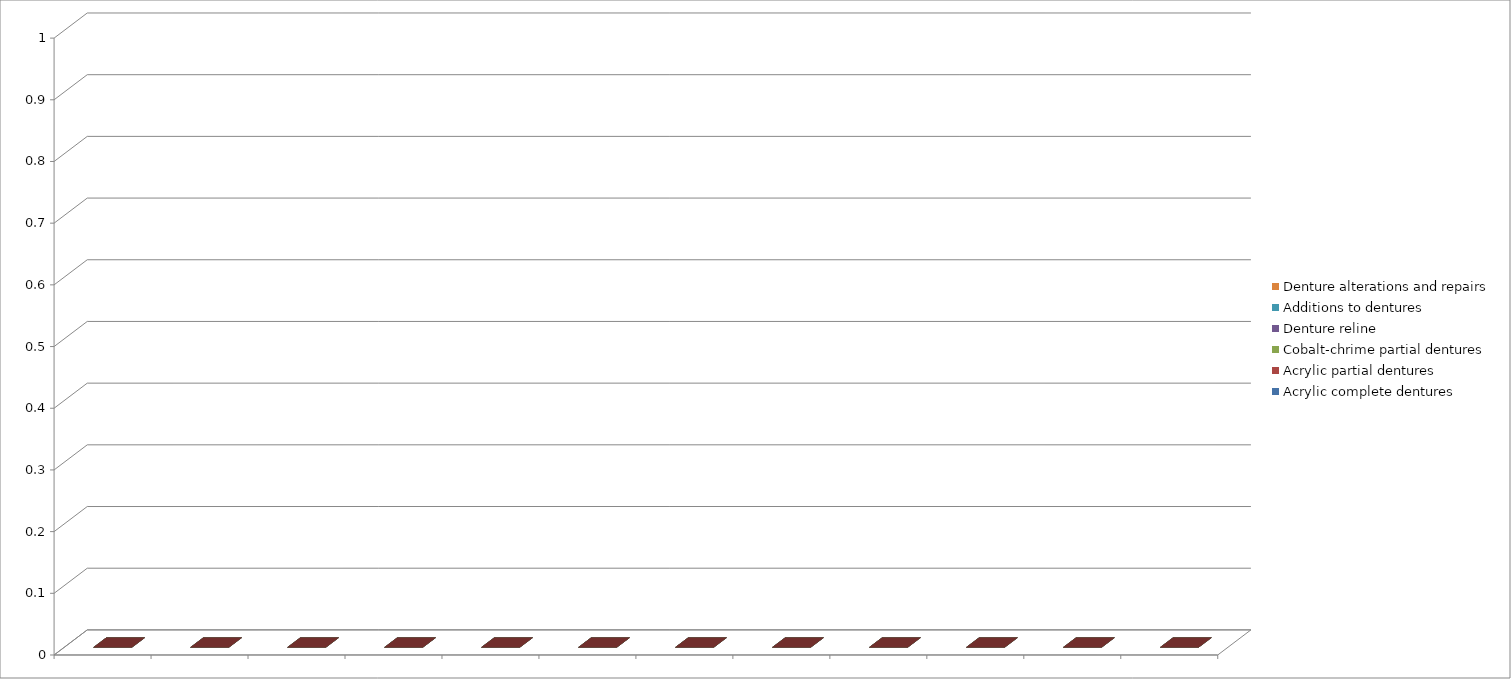
| Category | Acrylic complete dentures | Acrylic partial dentures | Cobalt-chrime partial dentures | Denture reline | Additions to dentures | Denture alterations and repairs |
|---|---|---|---|---|---|---|
| 0 | 0 | 0 | 0 | 0 | 0 | 0 |
| 1 | 0 | 0 | 0 | 0 | 0 | 0 |
| 2 | 0 | 0 | 0 | 0 | 0 | 0 |
| 3 | 0 | 0 | 0 | 0 | 0 | 0 |
| 4 | 0 | 0 | 0 | 0 | 0 | 0 |
| 5 | 0 | 0 | 0 | 0 | 0 | 0 |
| 6 | 0 | 0 | 0 | 0 | 0 | 0 |
| 7 | 0 | 0 | 0 | 0 | 0 | 0 |
| 8 | 0 | 0 | 0 | 0 | 0 | 0 |
| 9 | 0 | 0 | 0 | 0 | 0 | 0 |
| 10 | 0 | 0 | 0 | 0 | 0 | 0 |
| 11 | 0 | 0 | 0 | 0 | 0 | 0 |